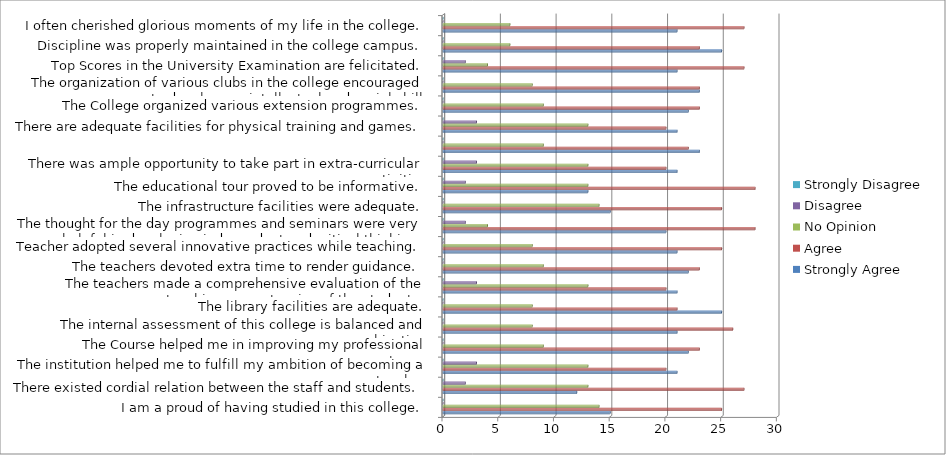
| Category | Strongly Agree  | Agree | No Opinion  | Disagree | Strongly Disagree  |
|---|---|---|---|---|---|
| I am a proud of having studied in this college. | 15 | 25 | 14 | 0 | 0 |
| There existed cordial relation between the staff and students.  | 12 | 27 | 13 | 2 | 0 |
| The institution helped me to fulfill my ambition of becoming a teacher. | 21 | 20 | 13 | 3 | 0 |
| The Course helped me in improving my professional competency. | 22 | 23 | 9 | 0 | 0 |
| The internal assessment of this college is balanced and objective. | 21 | 26 | 8 | 0 | 0 |
| The library facilities are adequate. | 25 | 21 | 8 | 0 | 0 |
| The teachers made a comprehensive evaluation of the teaching competencies of the students. | 21 | 20 | 13 | 3 | 0 |
| The teachers devoted extra time to render guidance. | 22 | 23 | 9 | 0 | 0 |
| Teacher adopted several innovative practices while teaching. | 21 | 25 | 8 | 0 | 0 |
| The thought for the day programmes and seminars were very helpful in developing independent and critical thinking. | 20 | 28 | 4 | 2 | 0 |
| The infrastructure facilities were adequate. | 15 | 25 | 14 | 0 | 0 |
| The educational tour proved to be informative. | 13 | 28 | 13 | 2 | 0 |
| There was ample opportunity to take part in extra-curricular activities. | 21 | 20 | 13 | 3 | 0 |
|  | 23 | 22 | 9 | 0 | 0 |
| There are adequate facilities for physical training and games. | 21 | 20 | 13 | 3 | 0 |
| The College organized various extension programmes. | 22 | 23 | 9 | 0 | 0 |
| The organization of various clubs in the college encouraged me to develop my intellectual and social skill. | 23 | 23 | 8 | 0 | 0 |
| Top Scores in the University Examination are felicitated. | 21 | 27 | 4 | 2 | 0 |
| Discipline was properly maintained in the college campus. | 25 | 23 | 6 | 0 | 0 |
| I often cherished glorious moments of my life in the college. | 21 | 27 | 6 | 0 | 0 |